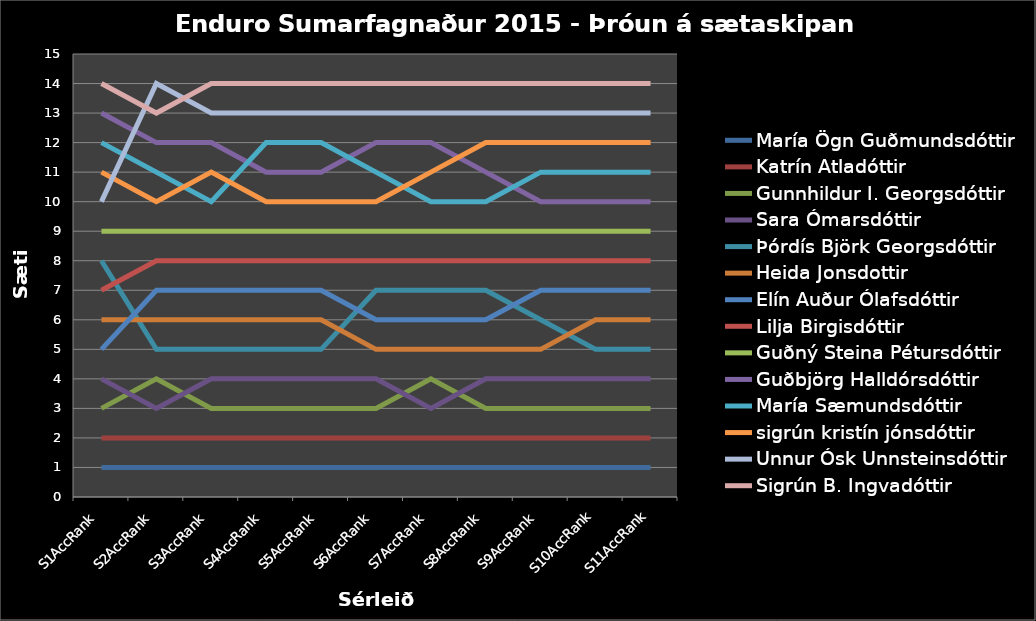
| Category | María Ögn Guðmundsdóttir  | Katrín Atladóttir  | Gunnhildur I. Georgsdóttir  | Sara Ómarsdóttir  | Þórdís Björk Georgsdóttir  | Heida Jonsdottir  | Elín Auður Ólafsdóttir  | Lilja Birgisdóttir  | Guðný Steina Pétursdóttir  | Guðbjörg Halldórsdóttir  | María Sæmundsdóttir  | sigrún kristín jónsdóttir  | Unnur Ósk Unnsteinsdóttir  | Sigrún B. Ingvadóttir  |
|---|---|---|---|---|---|---|---|---|---|---|---|---|---|---|
| S1AccRank | 1 | 2 | 3 | 4 | 8 | 6 | 5 | 7 | 9 | 13 | 12 | 11 | 10 | 14 |
| S2AccRank | 1 | 2 | 4 | 3 | 5 | 6 | 7 | 8 | 9 | 12 | 11 | 10 | 14 | 13 |
| S3AccRank | 1 | 2 | 3 | 4 | 5 | 6 | 7 | 8 | 9 | 12 | 10 | 11 | 13 | 14 |
| S4AccRank | 1 | 2 | 3 | 4 | 5 | 6 | 7 | 8 | 9 | 11 | 12 | 10 | 13 | 14 |
| S5AccRank | 1 | 2 | 3 | 4 | 5 | 6 | 7 | 8 | 9 | 11 | 12 | 10 | 13 | 14 |
| S6AccRank | 1 | 2 | 3 | 4 | 7 | 5 | 6 | 8 | 9 | 12 | 11 | 10 | 13 | 14 |
| S7AccRank | 1 | 2 | 4 | 3 | 7 | 5 | 6 | 8 | 9 | 12 | 10 | 11 | 13 | 14 |
| S8AccRank | 1 | 2 | 3 | 4 | 7 | 5 | 6 | 8 | 9 | 11 | 10 | 12 | 13 | 14 |
| S9AccRank | 1 | 2 | 3 | 4 | 6 | 5 | 7 | 8 | 9 | 10 | 11 | 12 | 13 | 14 |
| S10AccRank | 1 | 2 | 3 | 4 | 5 | 6 | 7 | 8 | 9 | 10 | 11 | 12 | 13 | 14 |
| S11AccRank | 1 | 2 | 3 | 4 | 5 | 6 | 7 | 8 | 9 | 10 | 11 | 12 | 13 | 14 |